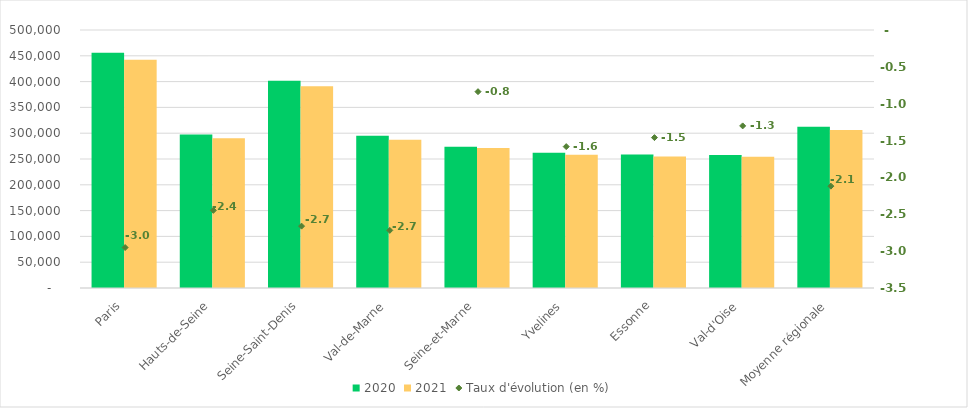
| Category | 2020 | 2021 |
|---|---|---|
| Paris | 455688 | 442240 |
| Hauts-de-Seine | 297374 | 290098 |
| Seine-Saint-Denis | 401428 | 390747 |
| Val-de-Marne | 295176 | 287152 |
| Seine-et-Marne | 273548 | 271259 |
| Yvelines | 262248 | 258099 |
| Essonne | 258535 | 254761 |
| Val-d'Oise | 257595 | 254244 |
| Moyenne régionale | 312699 | 306075 |